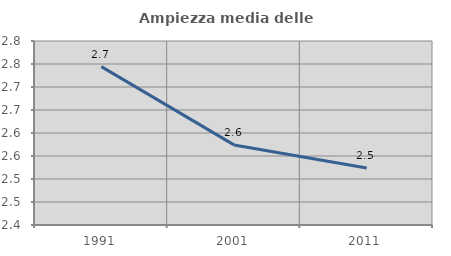
| Category | Ampiezza media delle famiglie |
|---|---|
| 1991.0 | 2.744 |
| 2001.0 | 2.574 |
| 2011.0 | 2.524 |